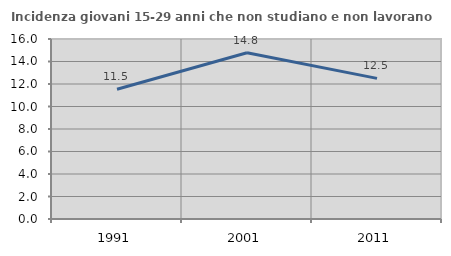
| Category | Incidenza giovani 15-29 anni che non studiano e non lavorano  |
|---|---|
| 1991.0 | 11.538 |
| 2001.0 | 14.778 |
| 2011.0 | 12.5 |